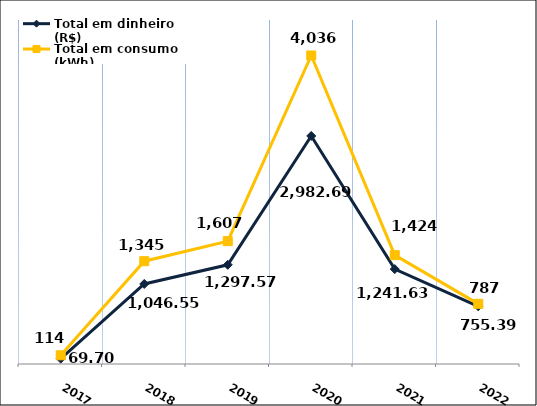
| Category | Total em dinheiro (R$) |
|---|---|
| 2017.0 | 69.7 |
| 2018.0 | 1046.55 |
| 2019.0 | 1297.57 |
| 2020.0 | 2982.69 |
| 2021.0 | 1241.63 |
| 2022.0 | 755.39 |